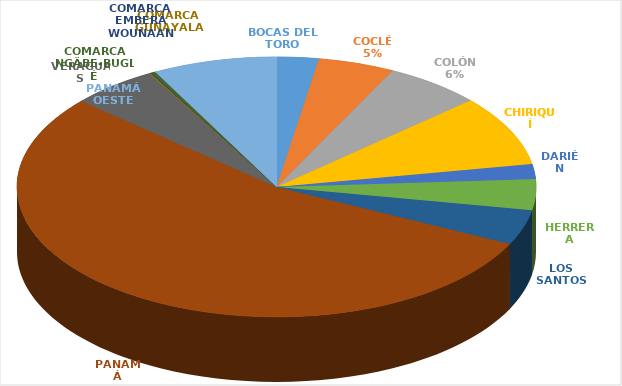
| Category | Cantidad  |
|---|---|
| BOCAS DEL TORO | 162 |
| COCLÉ | 295 |
| COLÓN | 374 |
| CHIRIQUÍ | 543 |
| DARIÉN | 115 |
| HERRERA | 237 |
| LOS SANTOS | 271 |
| PANAMÁ | 3359 |
| VERAGUAS | 333 |
| COMARCA GUNAYALA | 6 |
| COMARCA EMBERÁ WOUNAAN | 5 |
| COMARCA NGÄBE-BUGLÉ | 15 |
| PANAMÁ OESTE | 479 |